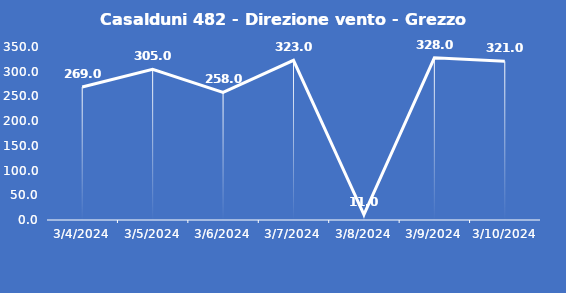
| Category | Casalduni 482 - Direzione vento - Grezzo (°N) |
|---|---|
| 3/4/24 | 269 |
| 3/5/24 | 305 |
| 3/6/24 | 258 |
| 3/7/24 | 323 |
| 3/8/24 | 11 |
| 3/9/24 | 328 |
| 3/10/24 | 321 |